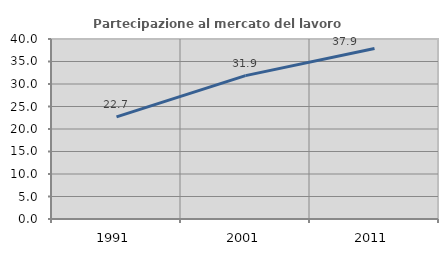
| Category | Partecipazione al mercato del lavoro  femminile |
|---|---|
| 1991.0 | 22.697 |
| 2001.0 | 31.858 |
| 2011.0 | 37.882 |